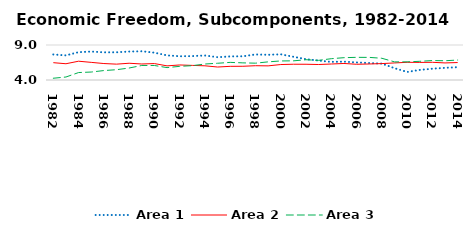
| Category | Area 1 | Area 2 | Area 3 |
|---|---|---|---|
| 1982.0 | 7.645 | 6.473 | 4.253 |
| 1983.0 | 7.515 | 6.322 | 4.427 |
| 1984.0 | 7.972 | 6.684 | 5.065 |
| 1985.0 | 8.065 | 6.518 | 5.136 |
| 1986.0 | 7.951 | 6.351 | 5.348 |
| 1987.0 | 7.958 | 6.264 | 5.472 |
| 1988.0 | 8.062 | 6.393 | 5.712 |
| 1989.0 | 8.108 | 6.288 | 6.075 |
| 1990.0 | 7.906 | 6.347 | 6.074 |
| 1991.0 | 7.515 | 6.02 | 5.769 |
| 1992.0 | 7.392 | 6.149 | 5.953 |
| 1993.0 | 7.415 | 6.087 | 6.05 |
| 1994.0 | 7.503 | 6.029 | 6.283 |
| 1995.0 | 7.257 | 5.853 | 6.392 |
| 1996.0 | 7.37 | 5.953 | 6.517 |
| 1997.0 | 7.387 | 5.961 | 6.448 |
| 1998.0 | 7.649 | 6.041 | 6.404 |
| 1999.0 | 7.598 | 6.019 | 6.591 |
| 2000.0 | 7.674 | 6.208 | 6.721 |
| 2001.0 | 7.323 | 6.251 | 6.738 |
| 2002.0 | 6.972 | 6.25 | 6.895 |
| 2003.0 | 6.779 | 6.211 | 6.805 |
| 2004.0 | 6.587 | 6.284 | 7.044 |
| 2005.0 | 6.622 | 6.362 | 7.188 |
| 2006.0 | 6.512 | 6.247 | 7.237 |
| 2007.0 | 6.426 | 6.289 | 7.23 |
| 2008.0 | 6.342 | 6.344 | 7.103 |
| 2009.0 | 5.691 | 6.437 | 6.59 |
| 2010.0 | 5.148 | 6.529 | 6.593 |
| 2011.0 | 5.438 | 6.512 | 6.67 |
| 2012.0 | 5.617 | 6.527 | 6.779 |
| 2013.0 | 5.742 | 6.439 | 6.749 |
| 2014.0 | 5.83 | 6.494 | 6.852 |